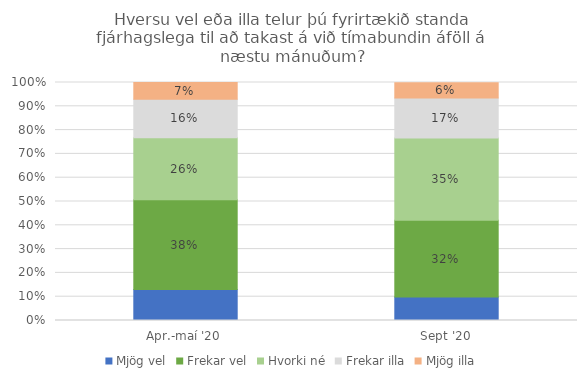
| Category | Mjög vel | Frekar vel | Hvorki né | Frekar illa | Mjög illa |
|---|---|---|---|---|---|
| Apr.-maí '20 | 0.13 | 0.377 | 0.261 | 0.162 | 0.07 |
| Sept '20 | 0.099 | 0.322 | 0.346 | 0.168 | 0.064 |